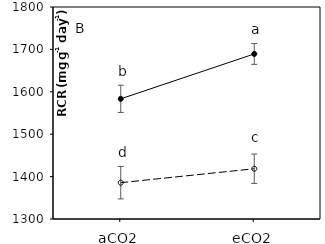
| Category | Bt | Xy |
|---|---|---|
| aCO2 | 1583.421 | 1385.687 |
| eCO2 | 1689.292 | 1418.536 |